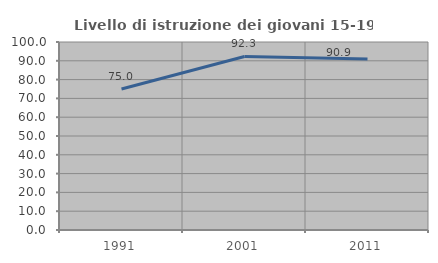
| Category | Livello di istruzione dei giovani 15-19 anni |
|---|---|
| 1991.0 | 75 |
| 2001.0 | 92.308 |
| 2011.0 | 90.909 |